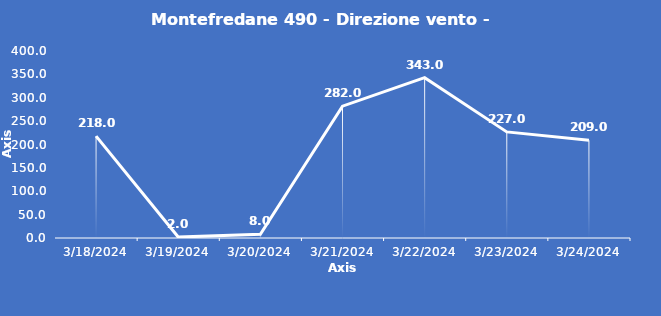
| Category | Montefredane 490 - Direzione vento - Grezzo (°N) |
|---|---|
| 3/18/24 | 218 |
| 3/19/24 | 2 |
| 3/20/24 | 8 |
| 3/21/24 | 282 |
| 3/22/24 | 343 |
| 3/23/24 | 227 |
| 3/24/24 | 209 |